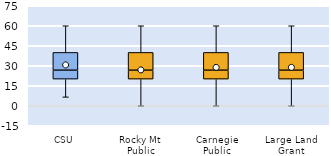
| Category | 25th | 50th | 75th |
|---|---|---|---|
| CSU | 20 | 6.667 | 13.333 |
| Rocky Mt Public | 20 | 6.667 | 13.333 |
| Carnegie Public | 20 | 6.667 | 13.333 |
| Large Land Grant | 20 | 6.667 | 13.333 |